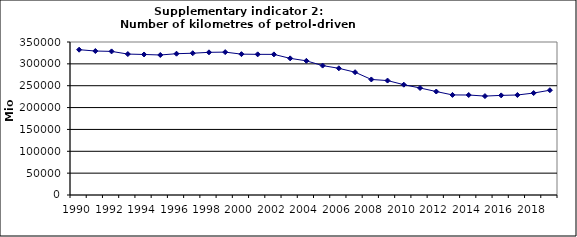
| Category | Number of kilometres of petrol-driven passenger cars, Mio km |
|---|---|
| 1990 | 332404.085 |
| 1991 | 329357.329 |
| 1992 | 328515.51 |
| 1993 | 322404.141 |
| 1994 | 321470.751 |
| 1995 | 320281.468 |
| 1996 | 323220.494 |
| 1997 | 324332.975 |
| 1998 | 326378.653 |
| 1999 | 326862.708 |
| 2000 | 322196.513 |
| 2001 | 321766.928 |
| 2002 | 321659.897 |
| 2003 | 312589.065 |
| 2004 | 306929.059 |
| 2005 | 295995.741 |
| 2006 | 289814.797 |
| 2007 | 280880.374 |
| 2008 | 264312.431 |
| 2009 | 261770.955 |
| 2010 | 252343.487 |
| 2011 | 244803.565 |
| 2012 | 236697.354 |
| 2013 | 228918.192 |
| 2014 | 228734.146 |
| 2015 | 226256.141 |
| 2016 | 227864.833 |
| 2017 | 228772.167 |
| 2018 | 233216.227 |
| 2019 | 239727.065 |